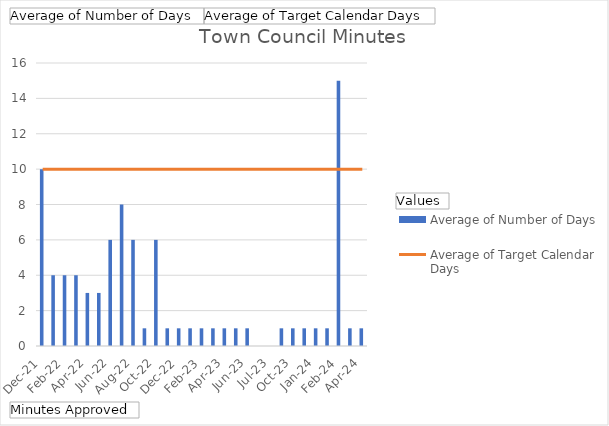
| Category | Average of Number of Days |
|---|---|
| Dec-21 | 10 |
| Jan-22 | 4 |
| Feb-22 | 4 |
| Mar-22 | 4 |
| Apr-22 | 3 |
| May-22 | 3 |
| Jun-22 | 6 |
| Jul-22 | 8 |
| Aug-22 | 6 |
| Sep-22 | 1 |
| Oct-22 | 6 |
| Nov-22 | 1 |
| Dec-22 | 1 |
| Jan-23 | 1 |
| Feb-23 | 1 |
| Mar-23 | 1 |
| Apr-23 | 1 |
| May-23 | 1 |
| Jun-23 | 1 |
| (blank) | 0 |
| Jul-23 | 0 |
| Aug-23 | 1 |
| Oct-23 | 1 |
| Nov-23 | 1 |
| Jan-24 | 1 |
| Dec-23 | 1 |
| Feb-24 | 15 |
| Mar-24 | 1 |
| Apr-24 | 1 |